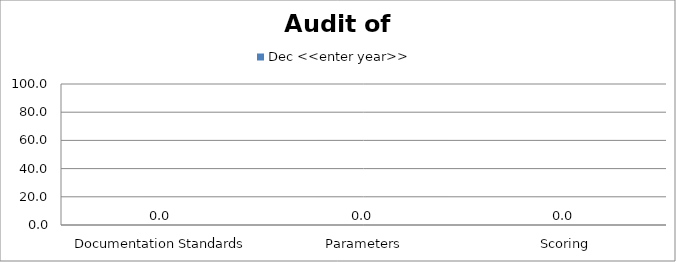
| Category | Dec <<enter year>> |
|---|---|
|  Documentation Standards | 0 |
|  Parameters | 0 |
|  Scoring | 0 |